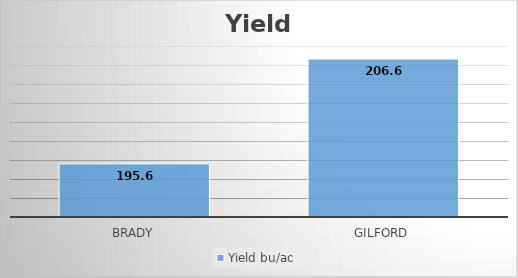
| Category | Yield bu/ac |
|---|---|
| Brady | 195.6 |
| Gilford | 206.63 |